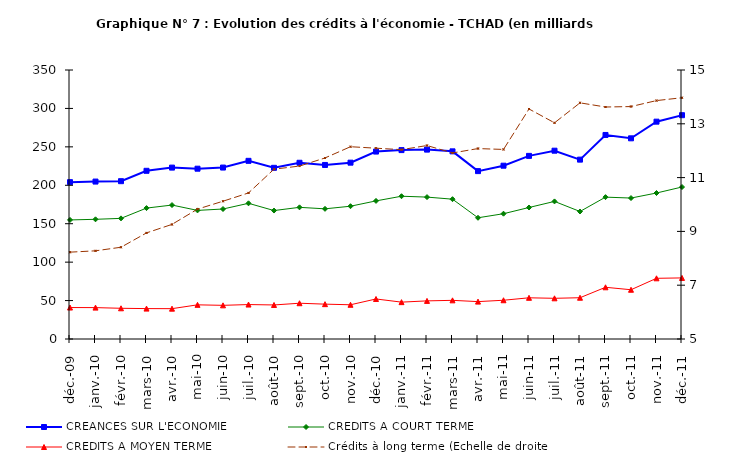
| Category | CREANCES SUR L'ECONOMIE | CREDITS A COURT TERME | CREDITS A MOYEN TERME |
|---|---|---|---|
| 2009-12-04 | 204080 | 154917 | 40935 |
| 2010-01-04 | 204835 | 155730 | 40827 |
| 2010-02-04 | 205340 | 156963 | 39966 |
| 2010-03-04 | 218839 | 170337 | 39558 |
| 2010-04-04 | 223004 | 174281 | 39462 |
| 2010-05-04 | 221589 | 167318 | 44443 |
| 2010-06-04 | 223062 | 169136 | 43804 |
| 2010-07-04 | 231810 | 176553 | 44827 |
| 2010-08-04 | 222715 | 167114 | 44288 |
| 2010-09-04 | 229288 | 171310 | 46549 |
| 2010-10-04 | 226437 | 169353 | 45354 |
| 2010-11-04 | 229443 | 172768 | 44527 |
| 2010-12-04 | 243868 | 179696 | 52079 |
| 2011-01-01 | 245780 | 185768 | 47973 |
| 2011-02-01 | 246418 | 184635 | 49591 |
| 2011-03-01 | 244154 | 181932 | 50306 |
| 2011-04-01 | 218445 | 157730 | 48636 |
| 2011-05-01 | 225488 | 163008 | 50433 |
| 2011-06-01 | 238252 | 171111 | 53590 |
| 2011-07-01 | 245010 | 179018 | 52955 |
| 2011-08-01 | 233384 | 165899 | 53706 |
| 2011-09-01 | 265485 | 184582 | 67279 |
| 2011-10-01 | 261109 | 183378 | 64090 |
| 2011-11-01 | 282780 | 189944 | 78973 |
| 2011-12-01 | 291197 | 197750 | 79478 |